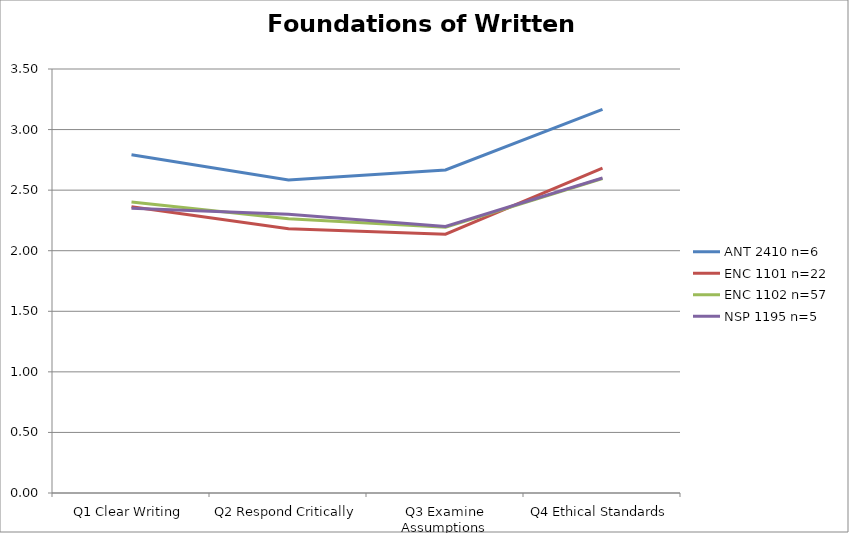
| Category | ANT 2410 n=6 | ENC 1101 n=22 | ENC 1102 n=57 | NSP 1195 n=5 |
|---|---|---|---|---|
| Q1 Clear Writing | 2.792 | 2.364 | 2.402 | 2.35 |
| Q2 Respond Critically | 2.583 | 2.182 | 2.263 | 2.3 |
|  Q3 Examine Assumptions | 2.667 | 2.136 | 2.193 | 2.2 |
| Q4 Ethical Standards | 3.167 | 2.682 | 2.596 | 2.6 |